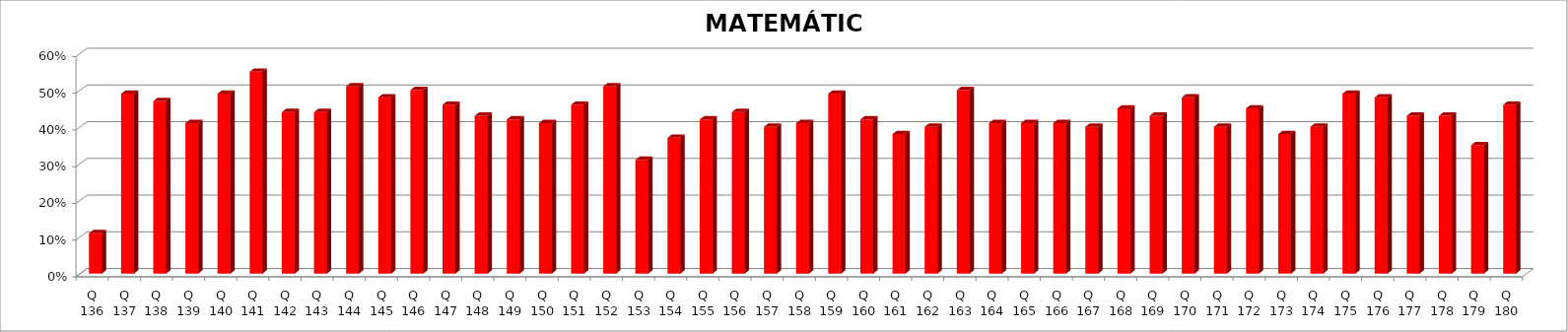
| Category | MATEMÁTICA |
|---|---|
| Q 136 | 0.11 |
| Q 137 | 0.49 |
| Q 138 | 0.47 |
| Q 139 | 0.41 |
| Q 140 | 0.49 |
| Q 141 | 0.55 |
| Q 142 | 0.44 |
| Q 143 | 0.44 |
| Q 144 | 0.51 |
| Q 145 | 0.48 |
| Q 146 | 0.5 |
| Q 147 | 0.46 |
| Q 148 | 0.43 |
| Q 149 | 0.42 |
| Q 150 | 0.41 |
| Q 151 | 0.46 |
| Q 152 | 0.51 |
| Q 153 | 0.31 |
| Q 154 | 0.37 |
| Q 155 | 0.42 |
| Q 156 | 0.44 |
| Q 157 | 0.4 |
| Q 158 | 0.41 |
| Q 159 | 0.49 |
| Q 160 | 0.42 |
| Q 161 | 0.38 |
| Q 162 | 0.4 |
| Q 163 | 0.5 |
| Q 164 | 0.41 |
| Q 165 | 0.41 |
| Q 166 | 0.41 |
| Q 167 | 0.4 |
| Q 168 | 0.45 |
| Q 169 | 0.43 |
| Q 170 | 0.48 |
| Q 171 | 0.4 |
| Q 172 | 0.45 |
| Q 173 | 0.38 |
| Q 174 | 0.4 |
| Q 175 | 0.49 |
| Q 176 | 0.48 |
| Q 177 | 0.43 |
| Q 178 | 0.43 |
| Q 179 | 0.35 |
| Q 180 | 0.46 |